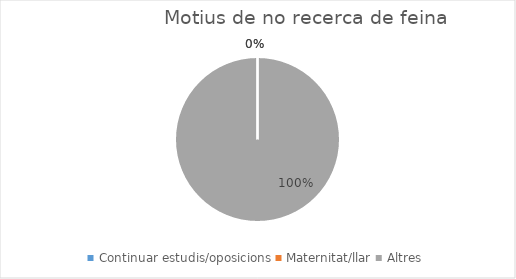
| Category | Series 0 |
|---|---|
| Continuar estudis/oposicions | 0 |
| Maternitat/llar | 0 |
| Altres | 1 |